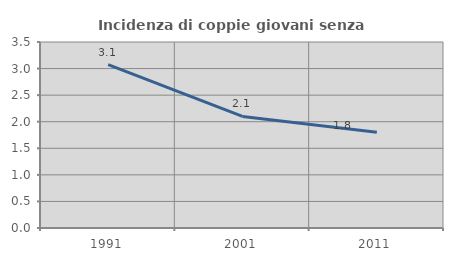
| Category | Incidenza di coppie giovani senza figli |
|---|---|
| 1991.0 | 3.074 |
| 2001.0 | 2.099 |
| 2011.0 | 1.804 |